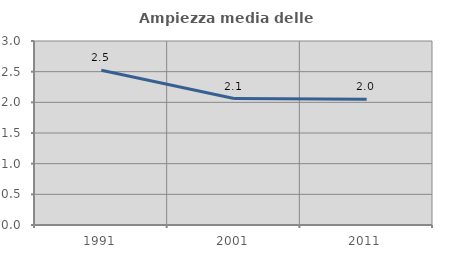
| Category | Ampiezza media delle famiglie |
|---|---|
| 1991.0 | 2.523 |
| 2001.0 | 2.062 |
| 2011.0 | 2.049 |